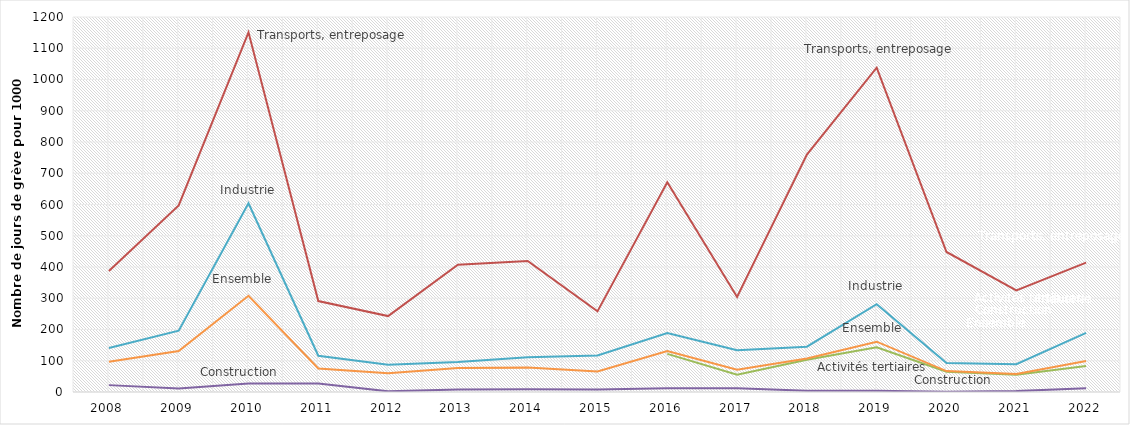
| Category | Services NC | Transports, entreposage | Activités tertiaires | Construction | Industrie | Ensemble | Services |
|---|---|---|---|---|---|---|---|
| 0 | 1 |  |  |  |  |  | 1 |